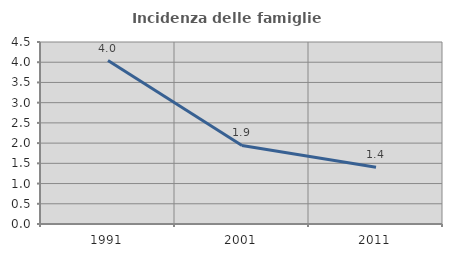
| Category | Incidenza delle famiglie numerose |
|---|---|
| 1991.0 | 4.04 |
| 2001.0 | 1.941 |
| 2011.0 | 1.404 |